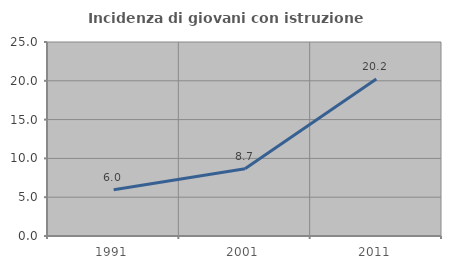
| Category | Incidenza di giovani con istruzione universitaria |
|---|---|
| 1991.0 | 5.956 |
| 2001.0 | 8.664 |
| 2011.0 | 20.22 |